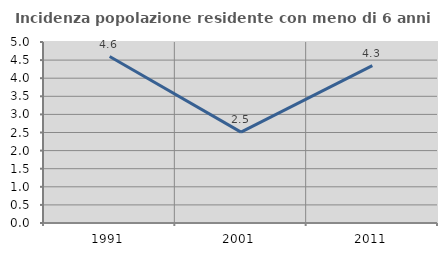
| Category | Incidenza popolazione residente con meno di 6 anni |
|---|---|
| 1991.0 | 4.598 |
| 2001.0 | 2.51 |
| 2011.0 | 4.348 |